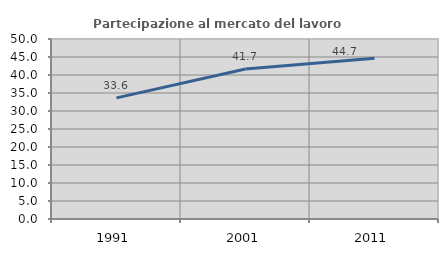
| Category | Partecipazione al mercato del lavoro  femminile |
|---|---|
| 1991.0 | 33.636 |
| 2001.0 | 41.661 |
| 2011.0 | 44.665 |